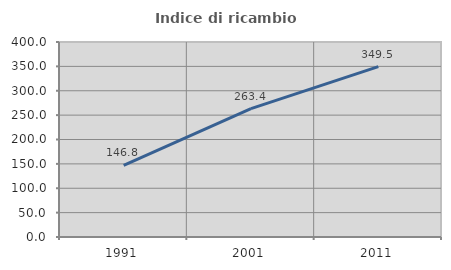
| Category | Indice di ricambio occupazionale  |
|---|---|
| 1991.0 | 146.816 |
| 2001.0 | 263.415 |
| 2011.0 | 349.5 |